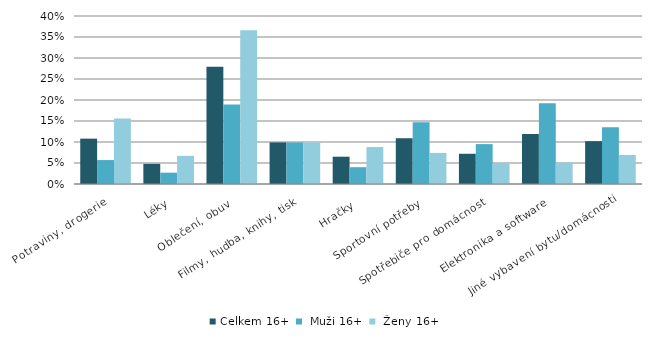
| Category | Celkem 16+ |  Muži 16+ |  Ženy 16+ |
|---|---|---|---|
| Potraviny, drogerie | 0.108 | 0.057 | 0.156 |
| Léky | 0.048 | 0.027 | 0.067 |
| Oblečení, obuv | 0.279 | 0.189 | 0.366 |
| Filmy, hudba, knihy, tisk | 0.099 | 0.099 | 0.099 |
| Hračky | 0.065 | 0.04 | 0.088 |
| Sportovní potřeby | 0.109 | 0.147 | 0.074 |
| Spotřebiče pro domácnost | 0.072 | 0.095 | 0.05 |
| Elektronika a software | 0.119 | 0.192 | 0.051 |
| Jiné vybavení bytu/domácnosti | 0.102 | 0.135 | 0.069 |